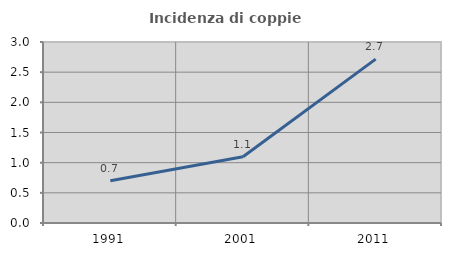
| Category | Incidenza di coppie miste |
|---|---|
| 1991.0 | 0.699 |
| 2001.0 | 1.098 |
| 2011.0 | 2.716 |